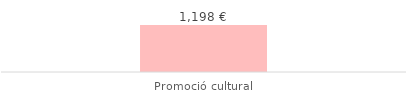
| Category | Total |
|---|---|
| Promoció cultural | 1197.9 |